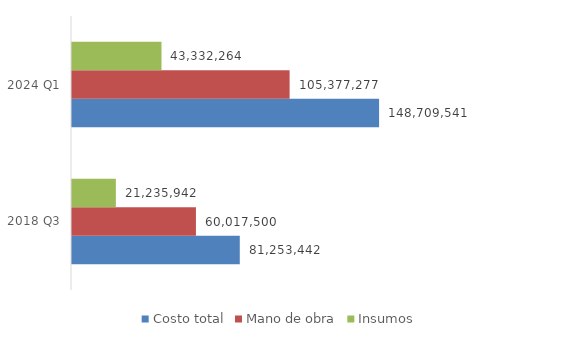
| Category | Costo total | Mano de obra | Insumos |
|---|---|---|---|
| 2018 Q3 | 81253442 | 60017500 | 21235942 |
| 2024 Q1 | 148709540.529 | 105377277 | 43332263.529 |